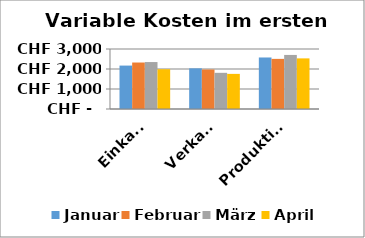
| Category | Januar | Februar | März | April |
|---|---|---|---|---|
| Einkauf | 2171 | 2324 | 2348 | 1989 |
| Verkauf | 2033 | 1975 | 1809 | 1756 |
| Produktion | 2576 | 2506 | 2703 | 2531 |